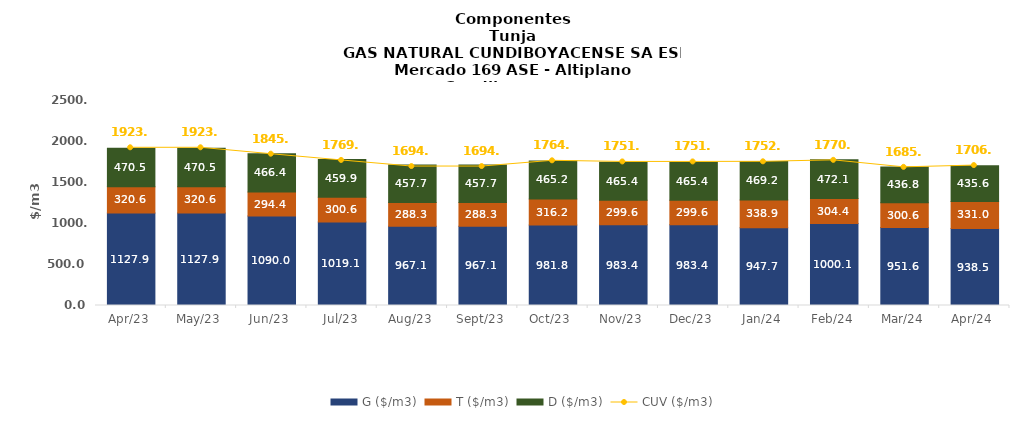
| Category | G ($/m3) | T ($/m3) | D ($/m3) |
|---|---|---|---|
| 2023-04-01 | 1127.9 | 320.55 | 470.54 |
| 2023-05-01 | 1127.9 | 320.55 | 470.54 |
| 2023-06-01 | 1090.01 | 294.4 | 466.35 |
| 2023-07-01 | 1019.05 | 300.55 | 459.92 |
| 2023-08-01 | 967.08 | 288.3 | 457.73 |
| 2023-09-01 | 967.08 | 288.3 | 457.72 |
| 2023-10-01 | 981.83 | 316.2 | 465.18 |
| 2023-11-01 | 983.39 | 299.62 | 465.37 |
| 2023-12-01 | 983.39 | 299.62 | 465.37 |
| 2024-01-01 | 947.72 | 338.94 | 469.19 |
| 2024-02-01 | 1000.09 | 304.43 | 472.07 |
| 2024-03-01 | 951.57 | 300.58 | 436.76 |
| 2024-04-01 | 938.45 | 331.03 | 435.61 |